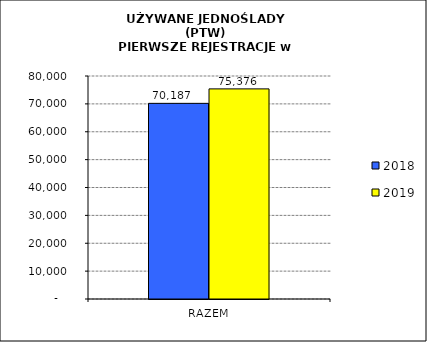
| Category | 2018 | 2019 |
|---|---|---|
| RAZEM | 70187 | 75376 |